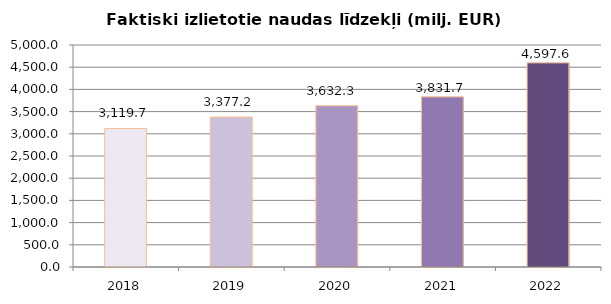
| Category | Faktiski izlietotie naudas līdzekļi (milj. EUR) ar PVN |
|---|---|
| 2018.0 | 3119.679 |
| 2019.0 | 3377.208 |
| 2020.0 | 3632.314 |
| 2021.0 | 3831.667 |
| 2022.0 | 4597.646 |